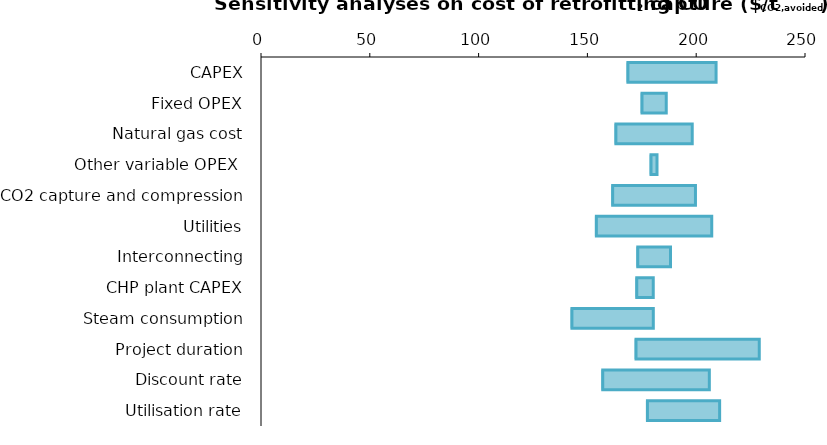
| Category | Minimum value | Increase of the parameter |
|---|---|---|
| CAPEX | 167.925 | 41.207 |
| Fixed OPEX | 174.385 | 11.804 |
| Natural gas cost | 162.4 | 35.775 |
| Other variable OPEX  | 178.54 | 3.495 |
| CO2 capture and compression | 160.916 | 38.742 |
| Utilities | 153.434 | 53.706 |
| Interconnecting | 172.425 | 15.725 |
| CHP plant CAPEX | 171.965 | 8.322 |
| Steam consumption | 142.202 | 38.085 |
| Project duration | 171.649 | 57.333 |
| Discount rate | 156.354 | 49.682 |
| Utilisation rate | 176.9 | 33.869 |